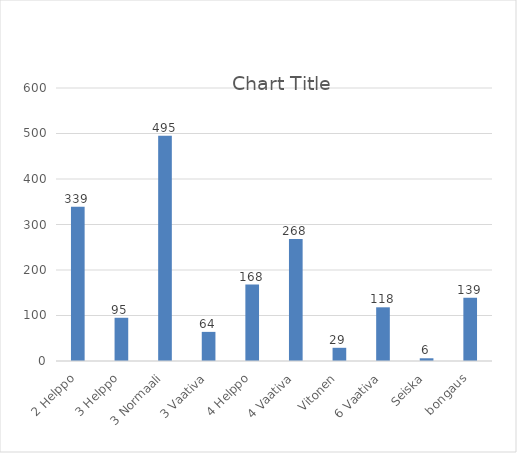
| Category | Series 0 |
|---|---|
| 2 Helppo | 339 |
| 3 Helppo | 95 |
| 3 Normaali | 495 |
| 3 Vaativa | 64 |
| 4 Helppo | 168 |
| 4 Vaativa | 268 |
| Vitonen | 29 |
| 6 Vaativa | 118 |
| Seiska | 6 |
| bongaus | 139 |